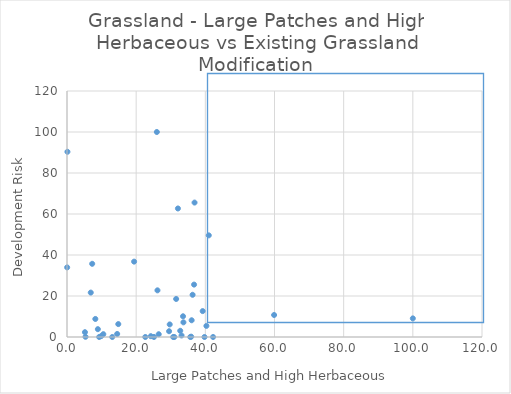
| Category | PerGrassMo |
|---|---|
| 5.350622595191254 | 0.102 |
| 22.63701813512988 | 0 |
| 25.144320383498506 | 0.016 |
| 19.40390055670119 | 36.765 |
| 13.084376622815753 | 0 |
| 5.188591815497197 | 2.343 |
| 9.303173389345671 | 0 |
| 8.92405651509221 | 3.821 |
| 24.237109782241692 | 0.405 |
| 14.509807208611708 | 1.484 |
| 26.519578402777455 | 1.349 |
| 9.88287962660897 | 0.435 |
| 36.04363204899762 | 8.163 |
| 36.74272567398478 | 25.561 |
| 40.99480202759517 | 49.584 |
| 59.884932679113525 | 10.733 |
| 29.51813982673841 | 2.818 |
| 36.88198739604197 | 65.575 |
| 25.975753091140433 | 100 |
| 33.6647497320263 | 7.145 |
| 33.12504276195527 | 0.745 |
| 31.03305030845732 | 0 |
| 7.2832702104447 | 35.706 |
| 0.04520002032421745 | 33.957 |
| 31.56336102562622 | 18.553 |
| 8.195730133258126 | 8.803 |
| 6.871532593801492 | 21.666 |
| 14.831394667530724 | 6.299 |
| 29.700850152436974 | 6.132 |
| 33.55065317629096 | 10.101 |
| 35.65205454412781 | 0 |
| 32.74419793650098 | 3.029 |
| 100.0 | 9.084 |
| 30.70477152079038 | 0 |
| 40.31248556700334 | 5.418 |
| 32.07782752284133 | 62.697 |
| 26.159048725259765 | 22.761 |
| 10.49879566608946 | 1.378 |
| 0.12697649512377712 | 90.35 |
| 35.91150129198621 | 0.16 |
| 42.23821327657488 | 0 |
| 39.23456222658581 | 12.63 |
| 39.75753588318784 | 0 |
| 36.31735902900215 | 20.59 |